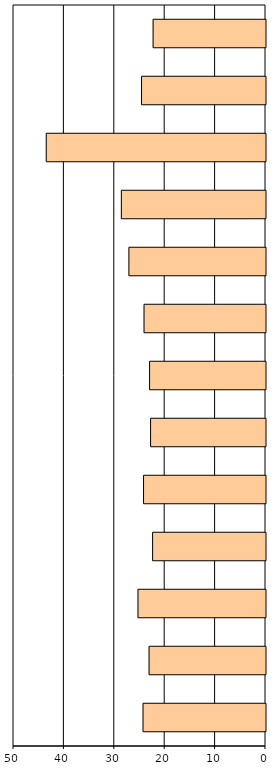
| Category | Series 0 |
|---|---|
| sonstige FB | 24.3 |
| Z00 - Z99 | 23.1 |
| S00 - T98 | 25.3 |
| M00 - M99 | 22.4 |
| L00 - L99 | 24.2 |
| K00 - K93 | 22.8 |
| J00 - J99 | 23 |
| I00 - I99 | 24.1 |
| H00 - H59 | 27.1 |
| G00 - G99 | 28.6 |
| F00 - F99 | 43.5 |
| E00 - E90 | 24.6 |
| C00 - D48 | 22.3 |